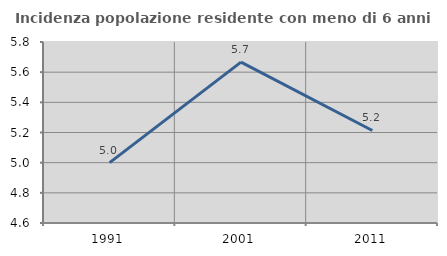
| Category | Incidenza popolazione residente con meno di 6 anni |
|---|---|
| 1991.0 | 5 |
| 2001.0 | 5.666 |
| 2011.0 | 5.213 |